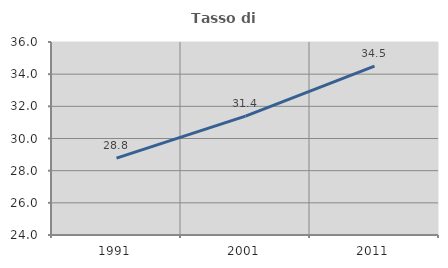
| Category | Tasso di occupazione   |
|---|---|
| 1991.0 | 28.782 |
| 2001.0 | 31.392 |
| 2011.0 | 34.495 |